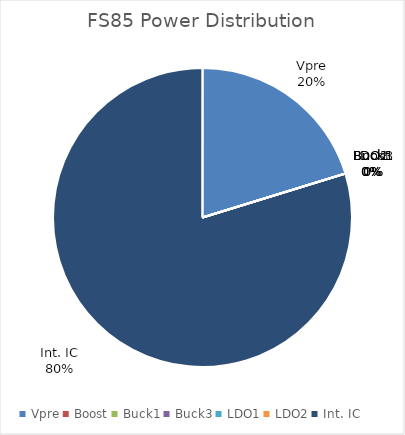
| Category | FS85 Power Distribution |
|---|---|
| Vpre | 0.018 |
| Boost | 0 |
| Buck1 | 0 |
| Buck3 | 0 |
| LDO1 | 0 |
| LDO2 | 0 |
| Int. IC | 0.07 |